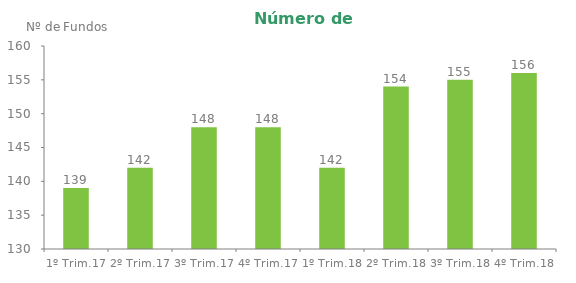
| Category | Series 0 |
|---|---|
| 1º Trim.17 | 139 |
| 2º Trim.17 | 142 |
| 3º Trim.17 | 148 |
| 4º Trim.17 | 148 |
| 1º Trim.18 | 142 |
| 2º Trim.18 | 154 |
| 3º Trim.18 | 155 |
| 4º Trim.18 | 156 |